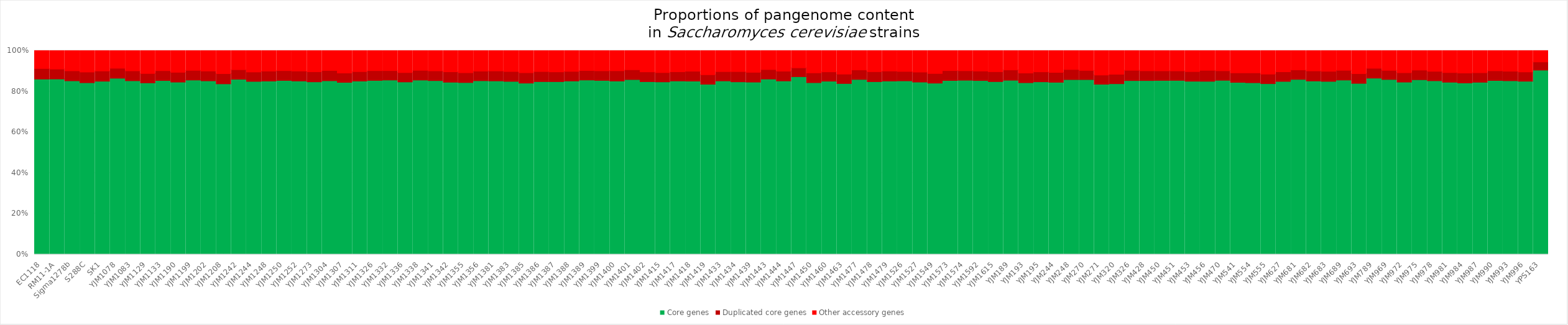
| Category | Core genes | Duplicated core genes | Other accessory genes |
|---|---|---|---|
| EC1118 | 4900 | 294 | 500 |
| RM11-1A | 4900 | 277 | 514 |
| Sigma1278b | 4900 | 282 | 569 |
| S288C | 4900 | 305 | 610 |
| SK1 | 4900 | 289 | 575 |
| YJM1078 | 4900 | 278 | 489 |
| YJM1083 | 4900 | 280 | 569 |
| YJM1129 | 4900 | 270 | 650 |
| YJM1133 | 4900 | 277 | 564 |
| YJM1190 | 4900 | 279 | 615 |
| YJM1199 | 4900 | 272 | 554 |
| YJM1202 | 4900 | 277 | 575 |
| YJM1208 | 4900 | 292 | 661 |
| YJM1242 | 4900 | 267 | 533 |
| YJM1244 | 4900 | 267 | 604 |
| YJM1248 | 4900 | 281 | 578 |
| YJM1250 | 4900 | 276 | 563 |
| YJM1252 | 4900 | 281 | 576 |
| YJM1273 | 4900 | 287 | 599 |
| YJM1304 | 4900 | 289 | 560 |
| YJM1307 | 4900 | 268 | 635 |
| YJM1311 | 4900 | 267 | 592 |
| YJM1326 | 4900 | 275 | 563 |
| YJM1332 | 4900 | 265 | 561 |
| YJM1336 | 4900 | 265 | 624 |
| YJM1338 | 4900 | 274 | 553 |
| YJM1341 | 4900 | 275 | 569 |
| YJM1342 | 4900 | 296 | 602 |
| YJM1355 | 4900 | 280 | 629 |
| YJM1356 | 4900 | 271 | 577 |
| YJM1381 | 4900 | 281 | 573 |
| YJM1383 | 4900 | 280 | 590 |
| YJM1385 | 4900 | 296 | 632 |
| YJM1386 | 4900 | 286 | 592 |
| YJM1387 | 4900 | 277 | 602 |
| YJM1388 | 4900 | 272 | 585 |
| YJM1389 | 4900 | 267 | 558 |
| YJM1399 | 4900 | 271 | 567 |
| YJM1400 | 4900 | 290 | 568 |
| YJM1401 | 4900 | 274 | 536 |
| YJM1402 | 4900 | 278 | 602 |
| YJM1415 | 4900 | 263 | 624 |
| YJM1417 | 4900 | 260 | 596 |
| YJM1418 | 4900 | 280 | 581 |
| YJM1419 | 4900 | 274 | 693 |
| YJM1433 | 4900 | 263 | 591 |
| YJM1434 | 4900 | 292 | 594 |
| YJM1439 | 4900 | 278 | 616 |
| YJM1443 | 4900 | 265 | 528 |
| YJM1444 | 4900 | 276 | 579 |
| YJM1447 | 4900 | 244 | 474 |
| YJM1450 | 4900 | 280 | 633 |
| YJM1460 | 4900 | 263 | 600 |
| YJM1463 | 4900 | 269 | 673 |
| YJM1477 | 4900 | 266 | 540 |
| YJM1478 | 4900 | 283 | 597 |
| YJM1479 | 4900 | 282 | 576 |
| YJM1526 | 4900 | 266 | 586 |
| YJM1527 | 4900 | 284 | 609 |
| YJM1549 | 4900 | 277 | 652 |
| YJM1573 | 4900 | 278 | 562 |
| YJM1574 | 4900 | 267 | 565 |
| YJM1592 | 4900 | 266 | 575 |
| YJM1615 | 4900 | 281 | 597 |
| YJM189 | 4900 | 289 | 543 |
| YJM193 | 4900 | 276 | 638 |
| YJM195 | 4900 | 283 | 602 |
| YJM244 | 4900 | 279 | 621 |
| YJM248 | 4900 | 283 | 528 |
| YJM270 | 4900 | 257 | 554 |
| YJM271 | 4900 | 267 | 700 |
| YJM320 | 4900 | 272 | 677 |
| YJM326 | 4900 | 289 | 554 |
| YJM428 | 4900 | 275 | 567 |
| YJM450 | 4900 | 270 | 568 |
| YJM451 | 4900 | 268 | 569 |
| YJM453 | 4900 | 273 | 592 |
| YJM456 | 4900 | 310 | 557 |
| YJM470 | 4900 | 268 | 566 |
| YJM541 | 4900 | 271 | 632 |
| YJM554 | 4900 | 279 | 636 |
| YJM555 | 4900 | 273 | 674 |
| YJM627 | 4900 | 273 | 598 |
| YJM681 | 4900 | 265 | 539 |
| YJM682 | 4900 | 285 | 572 |
| YJM683 | 4900 | 286 | 584 |
| YJM689 | 4900 | 274 | 552 |
| YJM693 | 4900 | 277 | 660 |
| YJM789 | 4900 | 274 | 490 |
| YJM969 | 4900 | 255 | 552 |
| YJM972 | 4900 | 268 | 626 |
| YJM975 | 4900 | 270 | 545 |
| YJM978 | 4900 | 267 | 582 |
| YJM981 | 4900 | 275 | 623 |
| YJM984 | 4900 | 282 | 641 |
| YJM987 | 4900 | 270 | 629 |
| YJM990 | 4900 | 273 | 567 |
| YJM993 | 4900 | 269 | 580 |
| YJM996 | 4900 | 263 | 602 |
| YPS163 | 4900 | 218 | 300 |